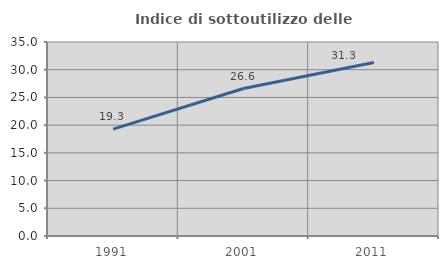
| Category | Indice di sottoutilizzo delle abitazioni  |
|---|---|
| 1991.0 | 19.283 |
| 2001.0 | 26.608 |
| 2011.0 | 31.291 |